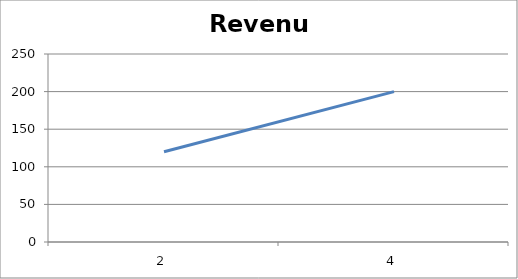
| Category | Series 0 |
|---|---|
| 2.0 | 120 |
| 4.0 | 200 |